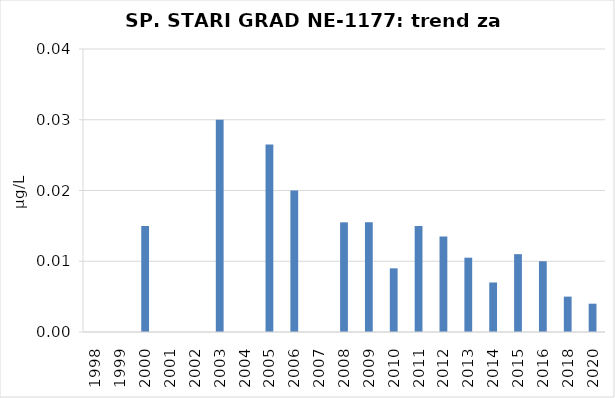
| Category | Vsota |
|---|---|
| 1998 | 0 |
| 1999 | 0 |
| 2000 | 0.015 |
| 2001 | 0 |
| 2002 | 0 |
| 2003 | 0.03 |
| 2004 | 0 |
| 2005 | 0.026 |
| 2006 | 0.02 |
| 2007 | 0 |
| 2008 | 0.016 |
| 2009 | 0.016 |
| 2010 | 0.009 |
| 2011 | 0.015 |
| 2012 | 0.014 |
| 2013 | 0.01 |
| 2014 | 0.007 |
| 2015 | 0.011 |
| 2016 | 0.01 |
| 2018 | 0.005 |
| 2020 | 0.004 |